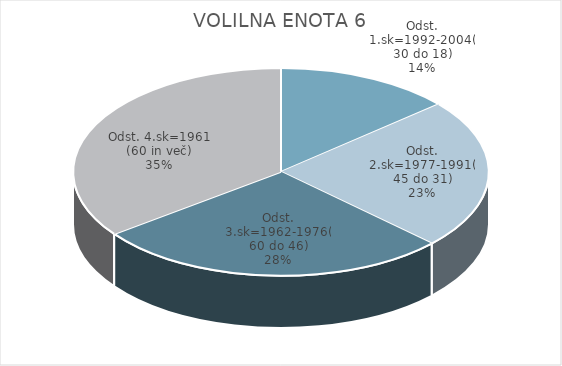
| Category | VOLILNA ENOTA 6 |
|---|---|
| Odst. 1.sk=1992-2004(30 do 18) | 9.49 |
| Odst. 2.sk=1977-1991(45 do 31) | 16.22 |
| Odst. 3.sk=1962-1976(60 do 46) | 19.18 |
| Odst. 4.sk=1961 (60 in več) | 24.38 |